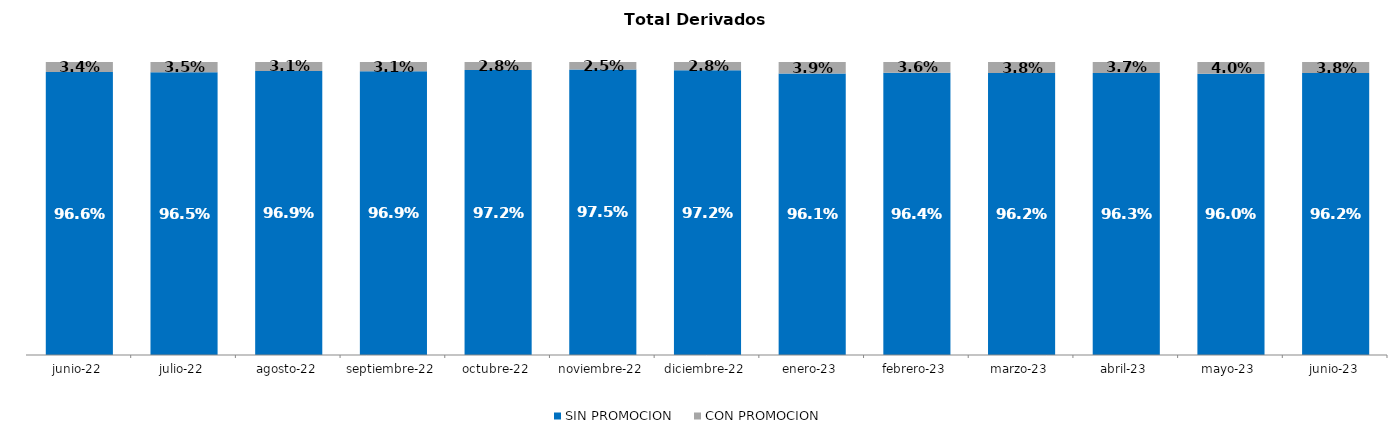
| Category | SIN PROMOCION   | CON PROMOCION   |
|---|---|---|
| 2022-06-01 | 0.966 | 0.034 |
| 2022-07-01 | 0.965 | 0.035 |
| 2022-08-01 | 0.969 | 0.031 |
| 2022-09-01 | 0.969 | 0.031 |
| 2022-10-01 | 0.972 | 0.028 |
| 2022-11-01 | 0.975 | 0.025 |
| 2022-12-01 | 0.972 | 0.028 |
| 2023-01-01 | 0.961 | 0.039 |
| 2023-02-01 | 0.964 | 0.036 |
| 2023-03-01 | 0.962 | 0.038 |
| 2023-04-01 | 0.963 | 0.037 |
| 2023-05-01 | 0.96 | 0.04 |
| 2023-06-01 | 0.962 | 0.038 |